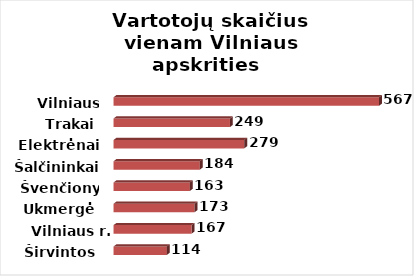
| Category | Series 0 |
|---|---|
| Širvintos | 113.9 |
| Vilniaus r. | 166.804 |
| Ukmergė | 172.898 |
| Švenčionys | 162.975 |
| Šalčininkai | 184.214 |
| Elektrėnai | 279.207 |
| Trakai | 248.639 |
| Vilniaus m. | 567.083 |